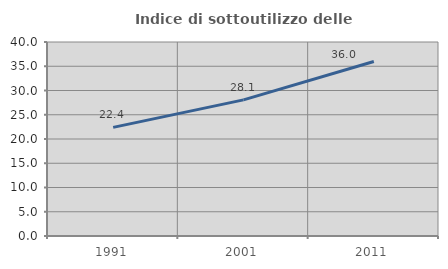
| Category | Indice di sottoutilizzo delle abitazioni  |
|---|---|
| 1991.0 | 22.391 |
| 2001.0 | 28.07 |
| 2011.0 | 35.978 |